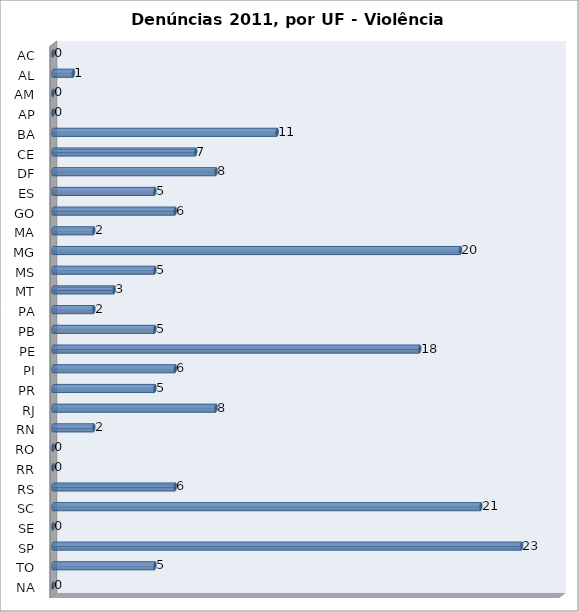
| Category | Series 0 |
|---|---|
| AC | 0 |
| AL | 1 |
| AM | 0 |
| AP | 0 |
| BA | 11 |
| CE | 7 |
| DF | 8 |
| ES | 5 |
| GO | 6 |
| MA | 2 |
| MG | 20 |
| MS | 5 |
| MT | 3 |
| PA | 2 |
| PB | 5 |
| PE | 18 |
| PI | 6 |
| PR | 5 |
| RJ | 8 |
| RN | 2 |
| RO | 0 |
| RR | 0 |
| RS | 6 |
| SC | 21 |
| SE | 0 |
| SP | 23 |
| TO | 5 |
| NA | 0 |